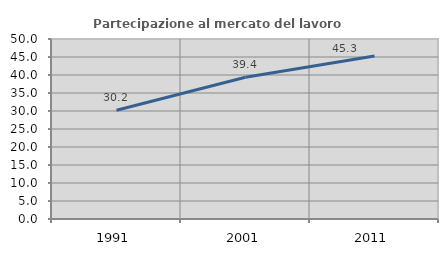
| Category | Partecipazione al mercato del lavoro  femminile |
|---|---|
| 1991.0 | 30.194 |
| 2001.0 | 39.392 |
| 2011.0 | 45.302 |